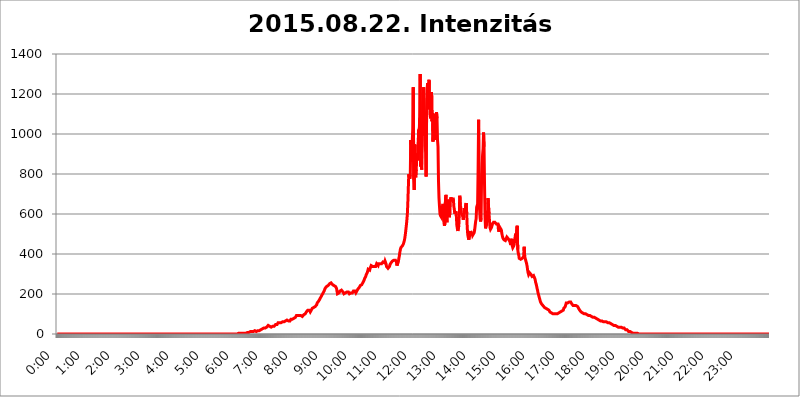
| Category | 2015.08.22. Intenzitás [W/m^2] |
|---|---|
| 0.0 | 0 |
| 0.0006944444444444445 | 0 |
| 0.001388888888888889 | 0 |
| 0.0020833333333333333 | 0 |
| 0.002777777777777778 | 0 |
| 0.003472222222222222 | 0 |
| 0.004166666666666667 | 0 |
| 0.004861111111111111 | 0 |
| 0.005555555555555556 | 0 |
| 0.0062499999999999995 | 0 |
| 0.006944444444444444 | 0 |
| 0.007638888888888889 | 0 |
| 0.008333333333333333 | 0 |
| 0.009027777777777779 | 0 |
| 0.009722222222222222 | 0 |
| 0.010416666666666666 | 0 |
| 0.011111111111111112 | 0 |
| 0.011805555555555555 | 0 |
| 0.012499999999999999 | 0 |
| 0.013194444444444444 | 0 |
| 0.013888888888888888 | 0 |
| 0.014583333333333332 | 0 |
| 0.015277777777777777 | 0 |
| 0.015972222222222224 | 0 |
| 0.016666666666666666 | 0 |
| 0.017361111111111112 | 0 |
| 0.018055555555555557 | 0 |
| 0.01875 | 0 |
| 0.019444444444444445 | 0 |
| 0.02013888888888889 | 0 |
| 0.020833333333333332 | 0 |
| 0.02152777777777778 | 0 |
| 0.022222222222222223 | 0 |
| 0.02291666666666667 | 0 |
| 0.02361111111111111 | 0 |
| 0.024305555555555556 | 0 |
| 0.024999999999999998 | 0 |
| 0.025694444444444447 | 0 |
| 0.02638888888888889 | 0 |
| 0.027083333333333334 | 0 |
| 0.027777777777777776 | 0 |
| 0.02847222222222222 | 0 |
| 0.029166666666666664 | 0 |
| 0.029861111111111113 | 0 |
| 0.030555555555555555 | 0 |
| 0.03125 | 0 |
| 0.03194444444444445 | 0 |
| 0.03263888888888889 | 0 |
| 0.03333333333333333 | 0 |
| 0.034027777777777775 | 0 |
| 0.034722222222222224 | 0 |
| 0.035416666666666666 | 0 |
| 0.036111111111111115 | 0 |
| 0.03680555555555556 | 0 |
| 0.0375 | 0 |
| 0.03819444444444444 | 0 |
| 0.03888888888888889 | 0 |
| 0.03958333333333333 | 0 |
| 0.04027777777777778 | 0 |
| 0.04097222222222222 | 0 |
| 0.041666666666666664 | 0 |
| 0.042361111111111106 | 0 |
| 0.04305555555555556 | 0 |
| 0.043750000000000004 | 0 |
| 0.044444444444444446 | 0 |
| 0.04513888888888889 | 0 |
| 0.04583333333333334 | 0 |
| 0.04652777777777778 | 0 |
| 0.04722222222222222 | 0 |
| 0.04791666666666666 | 0 |
| 0.04861111111111111 | 0 |
| 0.049305555555555554 | 0 |
| 0.049999999999999996 | 0 |
| 0.05069444444444445 | 0 |
| 0.051388888888888894 | 0 |
| 0.052083333333333336 | 0 |
| 0.05277777777777778 | 0 |
| 0.05347222222222222 | 0 |
| 0.05416666666666667 | 0 |
| 0.05486111111111111 | 0 |
| 0.05555555555555555 | 0 |
| 0.05625 | 0 |
| 0.05694444444444444 | 0 |
| 0.057638888888888885 | 0 |
| 0.05833333333333333 | 0 |
| 0.05902777777777778 | 0 |
| 0.059722222222222225 | 0 |
| 0.06041666666666667 | 0 |
| 0.061111111111111116 | 0 |
| 0.06180555555555556 | 0 |
| 0.0625 | 0 |
| 0.06319444444444444 | 0 |
| 0.06388888888888888 | 0 |
| 0.06458333333333334 | 0 |
| 0.06527777777777778 | 0 |
| 0.06597222222222222 | 0 |
| 0.06666666666666667 | 0 |
| 0.06736111111111111 | 0 |
| 0.06805555555555555 | 0 |
| 0.06874999999999999 | 0 |
| 0.06944444444444443 | 0 |
| 0.07013888888888889 | 0 |
| 0.07083333333333333 | 0 |
| 0.07152777777777779 | 0 |
| 0.07222222222222223 | 0 |
| 0.07291666666666667 | 0 |
| 0.07361111111111111 | 0 |
| 0.07430555555555556 | 0 |
| 0.075 | 0 |
| 0.07569444444444444 | 0 |
| 0.0763888888888889 | 0 |
| 0.07708333333333334 | 0 |
| 0.07777777777777778 | 0 |
| 0.07847222222222222 | 0 |
| 0.07916666666666666 | 0 |
| 0.0798611111111111 | 0 |
| 0.08055555555555556 | 0 |
| 0.08125 | 0 |
| 0.08194444444444444 | 0 |
| 0.08263888888888889 | 0 |
| 0.08333333333333333 | 0 |
| 0.08402777777777777 | 0 |
| 0.08472222222222221 | 0 |
| 0.08541666666666665 | 0 |
| 0.08611111111111112 | 0 |
| 0.08680555555555557 | 0 |
| 0.08750000000000001 | 0 |
| 0.08819444444444445 | 0 |
| 0.08888888888888889 | 0 |
| 0.08958333333333333 | 0 |
| 0.09027777777777778 | 0 |
| 0.09097222222222222 | 0 |
| 0.09166666666666667 | 0 |
| 0.09236111111111112 | 0 |
| 0.09305555555555556 | 0 |
| 0.09375 | 0 |
| 0.09444444444444444 | 0 |
| 0.09513888888888888 | 0 |
| 0.09583333333333333 | 0 |
| 0.09652777777777777 | 0 |
| 0.09722222222222222 | 0 |
| 0.09791666666666667 | 0 |
| 0.09861111111111111 | 0 |
| 0.09930555555555555 | 0 |
| 0.09999999999999999 | 0 |
| 0.10069444444444443 | 0 |
| 0.1013888888888889 | 0 |
| 0.10208333333333335 | 0 |
| 0.10277777777777779 | 0 |
| 0.10347222222222223 | 0 |
| 0.10416666666666667 | 0 |
| 0.10486111111111111 | 0 |
| 0.10555555555555556 | 0 |
| 0.10625 | 0 |
| 0.10694444444444444 | 0 |
| 0.1076388888888889 | 0 |
| 0.10833333333333334 | 0 |
| 0.10902777777777778 | 0 |
| 0.10972222222222222 | 0 |
| 0.1111111111111111 | 0 |
| 0.11180555555555556 | 0 |
| 0.11180555555555556 | 0 |
| 0.1125 | 0 |
| 0.11319444444444444 | 0 |
| 0.11388888888888889 | 0 |
| 0.11458333333333333 | 0 |
| 0.11527777777777777 | 0 |
| 0.11597222222222221 | 0 |
| 0.11666666666666665 | 0 |
| 0.1173611111111111 | 0 |
| 0.11805555555555557 | 0 |
| 0.11944444444444445 | 0 |
| 0.12013888888888889 | 0 |
| 0.12083333333333333 | 0 |
| 0.12152777777777778 | 0 |
| 0.12222222222222223 | 0 |
| 0.12291666666666667 | 0 |
| 0.12291666666666667 | 0 |
| 0.12361111111111112 | 0 |
| 0.12430555555555556 | 0 |
| 0.125 | 0 |
| 0.12569444444444444 | 0 |
| 0.12638888888888888 | 0 |
| 0.12708333333333333 | 0 |
| 0.16875 | 0 |
| 0.12847222222222224 | 0 |
| 0.12916666666666668 | 0 |
| 0.12986111111111112 | 0 |
| 0.13055555555555556 | 0 |
| 0.13125 | 0 |
| 0.13194444444444445 | 0 |
| 0.1326388888888889 | 0 |
| 0.13333333333333333 | 0 |
| 0.13402777777777777 | 0 |
| 0.13402777777777777 | 0 |
| 0.13472222222222222 | 0 |
| 0.13541666666666666 | 0 |
| 0.1361111111111111 | 0 |
| 0.13749999999999998 | 0 |
| 0.13819444444444443 | 0 |
| 0.1388888888888889 | 0 |
| 0.13958333333333334 | 0 |
| 0.14027777777777778 | 0 |
| 0.14097222222222222 | 0 |
| 0.14166666666666666 | 0 |
| 0.1423611111111111 | 0 |
| 0.14305555555555557 | 0 |
| 0.14375000000000002 | 0 |
| 0.14444444444444446 | 0 |
| 0.1451388888888889 | 0 |
| 0.1451388888888889 | 0 |
| 0.14652777777777778 | 0 |
| 0.14722222222222223 | 0 |
| 0.14791666666666667 | 0 |
| 0.1486111111111111 | 0 |
| 0.14930555555555555 | 0 |
| 0.15 | 0 |
| 0.15069444444444444 | 0 |
| 0.15138888888888888 | 0 |
| 0.15208333333333332 | 0 |
| 0.15277777777777776 | 0 |
| 0.15347222222222223 | 0 |
| 0.15416666666666667 | 0 |
| 0.15486111111111112 | 0 |
| 0.15555555555555556 | 0 |
| 0.15625 | 0 |
| 0.15694444444444444 | 0 |
| 0.15763888888888888 | 0 |
| 0.15833333333333333 | 0 |
| 0.15902777777777777 | 0 |
| 0.15972222222222224 | 0 |
| 0.16041666666666668 | 0 |
| 0.16111111111111112 | 0 |
| 0.16180555555555556 | 0 |
| 0.1625 | 0 |
| 0.16319444444444445 | 0 |
| 0.1638888888888889 | 0 |
| 0.16458333333333333 | 0 |
| 0.16527777777777777 | 0 |
| 0.16597222222222222 | 0 |
| 0.16666666666666666 | 0 |
| 0.1673611111111111 | 0 |
| 0.16805555555555554 | 0 |
| 0.16874999999999998 | 0 |
| 0.16944444444444443 | 0 |
| 0.17013888888888887 | 0 |
| 0.1708333333333333 | 0 |
| 0.17152777777777775 | 0 |
| 0.17222222222222225 | 0 |
| 0.1729166666666667 | 0 |
| 0.17361111111111113 | 0 |
| 0.17430555555555557 | 0 |
| 0.17500000000000002 | 0 |
| 0.17569444444444446 | 0 |
| 0.1763888888888889 | 0 |
| 0.17708333333333334 | 0 |
| 0.17777777777777778 | 0 |
| 0.17847222222222223 | 0 |
| 0.17916666666666667 | 0 |
| 0.1798611111111111 | 0 |
| 0.18055555555555555 | 0 |
| 0.18125 | 0 |
| 0.18194444444444444 | 0 |
| 0.1826388888888889 | 0 |
| 0.18333333333333335 | 0 |
| 0.1840277777777778 | 0 |
| 0.18472222222222223 | 0 |
| 0.18541666666666667 | 0 |
| 0.18611111111111112 | 0 |
| 0.18680555555555556 | 0 |
| 0.1875 | 0 |
| 0.18819444444444444 | 0 |
| 0.18888888888888888 | 0 |
| 0.18958333333333333 | 0 |
| 0.19027777777777777 | 0 |
| 0.1909722222222222 | 0 |
| 0.19166666666666665 | 0 |
| 0.19236111111111112 | 0 |
| 0.19305555555555554 | 0 |
| 0.19375 | 0 |
| 0.19444444444444445 | 0 |
| 0.1951388888888889 | 0 |
| 0.19583333333333333 | 0 |
| 0.19652777777777777 | 0 |
| 0.19722222222222222 | 0 |
| 0.19791666666666666 | 0 |
| 0.1986111111111111 | 0 |
| 0.19930555555555554 | 0 |
| 0.19999999999999998 | 0 |
| 0.20069444444444443 | 0 |
| 0.20138888888888887 | 0 |
| 0.2020833333333333 | 0 |
| 0.2027777777777778 | 0 |
| 0.2034722222222222 | 0 |
| 0.2041666666666667 | 0 |
| 0.20486111111111113 | 0 |
| 0.20555555555555557 | 0 |
| 0.20625000000000002 | 0 |
| 0.20694444444444446 | 0 |
| 0.2076388888888889 | 0 |
| 0.20833333333333334 | 0 |
| 0.20902777777777778 | 0 |
| 0.20972222222222223 | 0 |
| 0.21041666666666667 | 0 |
| 0.2111111111111111 | 0 |
| 0.21180555555555555 | 0 |
| 0.2125 | 0 |
| 0.21319444444444444 | 0 |
| 0.2138888888888889 | 0 |
| 0.21458333333333335 | 0 |
| 0.2152777777777778 | 0 |
| 0.21597222222222223 | 0 |
| 0.21666666666666667 | 0 |
| 0.21736111111111112 | 0 |
| 0.21805555555555556 | 0 |
| 0.21875 | 0 |
| 0.21944444444444444 | 0 |
| 0.22013888888888888 | 0 |
| 0.22083333333333333 | 0 |
| 0.22152777777777777 | 0 |
| 0.2222222222222222 | 0 |
| 0.22291666666666665 | 0 |
| 0.2236111111111111 | 0 |
| 0.22430555555555556 | 0 |
| 0.225 | 0 |
| 0.22569444444444445 | 0 |
| 0.2263888888888889 | 0 |
| 0.22708333333333333 | 0 |
| 0.22777777777777777 | 0 |
| 0.22847222222222222 | 0 |
| 0.22916666666666666 | 0 |
| 0.2298611111111111 | 0 |
| 0.23055555555555554 | 0 |
| 0.23124999999999998 | 0 |
| 0.23194444444444443 | 0 |
| 0.23263888888888887 | 0 |
| 0.2333333333333333 | 0 |
| 0.2340277777777778 | 0 |
| 0.2347222222222222 | 0 |
| 0.2354166666666667 | 0 |
| 0.23611111111111113 | 0 |
| 0.23680555555555557 | 0 |
| 0.23750000000000002 | 0 |
| 0.23819444444444446 | 0 |
| 0.2388888888888889 | 0 |
| 0.23958333333333334 | 0 |
| 0.24027777777777778 | 0 |
| 0.24097222222222223 | 0 |
| 0.24166666666666667 | 0 |
| 0.2423611111111111 | 0 |
| 0.24305555555555555 | 0 |
| 0.24375 | 0 |
| 0.24444444444444446 | 0 |
| 0.24513888888888888 | 0 |
| 0.24583333333333335 | 0 |
| 0.2465277777777778 | 0 |
| 0.24722222222222223 | 0 |
| 0.24791666666666667 | 0 |
| 0.24861111111111112 | 0 |
| 0.24930555555555556 | 0 |
| 0.25 | 0 |
| 0.25069444444444444 | 0 |
| 0.2513888888888889 | 0 |
| 0.2520833333333333 | 0 |
| 0.25277777777777777 | 0 |
| 0.2534722222222222 | 3.525 |
| 0.25416666666666665 | 3.525 |
| 0.2548611111111111 | 3.525 |
| 0.2555555555555556 | 3.525 |
| 0.25625000000000003 | 3.525 |
| 0.2569444444444445 | 3.525 |
| 0.2576388888888889 | 3.525 |
| 0.25833333333333336 | 3.525 |
| 0.2590277777777778 | 3.525 |
| 0.25972222222222224 | 3.525 |
| 0.2604166666666667 | 3.525 |
| 0.2611111111111111 | 3.525 |
| 0.26180555555555557 | 3.525 |
| 0.2625 | 3.525 |
| 0.26319444444444445 | 3.525 |
| 0.2638888888888889 | 3.525 |
| 0.26458333333333334 | 3.525 |
| 0.2652777777777778 | 3.525 |
| 0.2659722222222222 | 3.525 |
| 0.26666666666666666 | 7.887 |
| 0.2673611111111111 | 7.887 |
| 0.26805555555555555 | 7.887 |
| 0.26875 | 7.887 |
| 0.26944444444444443 | 7.887 |
| 0.2701388888888889 | 12.257 |
| 0.2708333333333333 | 12.257 |
| 0.27152777777777776 | 12.257 |
| 0.2722222222222222 | 12.257 |
| 0.27291666666666664 | 12.257 |
| 0.2736111111111111 | 12.257 |
| 0.2743055555555555 | 12.257 |
| 0.27499999999999997 | 12.257 |
| 0.27569444444444446 | 12.257 |
| 0.27638888888888885 | 16.636 |
| 0.27708333333333335 | 16.636 |
| 0.2777777777777778 | 12.257 |
| 0.27847222222222223 | 12.257 |
| 0.2791666666666667 | 12.257 |
| 0.2798611111111111 | 16.636 |
| 0.28055555555555556 | 16.636 |
| 0.28125 | 16.636 |
| 0.28194444444444444 | 16.636 |
| 0.2826388888888889 | 16.636 |
| 0.2833333333333333 | 16.636 |
| 0.28402777777777777 | 16.636 |
| 0.2847222222222222 | 21.024 |
| 0.28541666666666665 | 21.024 |
| 0.28611111111111115 | 25.419 |
| 0.28680555555555554 | 25.419 |
| 0.28750000000000003 | 25.419 |
| 0.2881944444444445 | 25.419 |
| 0.2888888888888889 | 29.823 |
| 0.28958333333333336 | 29.823 |
| 0.2902777777777778 | 29.823 |
| 0.29097222222222224 | 29.823 |
| 0.2916666666666667 | 29.823 |
| 0.2923611111111111 | 34.234 |
| 0.29305555555555557 | 34.234 |
| 0.29375 | 34.234 |
| 0.29444444444444445 | 34.234 |
| 0.2951388888888889 | 38.653 |
| 0.29583333333333334 | 43.079 |
| 0.2965277777777778 | 43.079 |
| 0.2972222222222222 | 38.653 |
| 0.29791666666666666 | 38.653 |
| 0.2986111111111111 | 34.234 |
| 0.29930555555555555 | 34.234 |
| 0.3 | 34.234 |
| 0.30069444444444443 | 38.653 |
| 0.3013888888888889 | 38.653 |
| 0.3020833333333333 | 38.653 |
| 0.30277777777777776 | 38.653 |
| 0.3034722222222222 | 38.653 |
| 0.30416666666666664 | 38.653 |
| 0.3048611111111111 | 43.079 |
| 0.3055555555555555 | 43.079 |
| 0.30624999999999997 | 47.511 |
| 0.3069444444444444 | 47.511 |
| 0.3076388888888889 | 43.079 |
| 0.30833333333333335 | 47.511 |
| 0.3090277777777778 | 51.951 |
| 0.30972222222222223 | 56.398 |
| 0.3104166666666667 | 56.398 |
| 0.3111111111111111 | 56.398 |
| 0.31180555555555556 | 56.398 |
| 0.3125 | 56.398 |
| 0.31319444444444444 | 56.398 |
| 0.3138888888888889 | 56.398 |
| 0.3145833333333333 | 56.398 |
| 0.31527777777777777 | 60.85 |
| 0.3159722222222222 | 60.85 |
| 0.31666666666666665 | 60.85 |
| 0.31736111111111115 | 60.85 |
| 0.31805555555555554 | 60.85 |
| 0.31875000000000003 | 65.31 |
| 0.3194444444444445 | 65.31 |
| 0.3201388888888889 | 65.31 |
| 0.32083333333333336 | 69.775 |
| 0.3215277777777778 | 69.775 |
| 0.32222222222222224 | 69.775 |
| 0.3229166666666667 | 65.31 |
| 0.3236111111111111 | 65.31 |
| 0.32430555555555557 | 65.31 |
| 0.325 | 65.31 |
| 0.32569444444444445 | 65.31 |
| 0.3263888888888889 | 65.31 |
| 0.32708333333333334 | 69.775 |
| 0.3277777777777778 | 74.246 |
| 0.3284722222222222 | 69.775 |
| 0.32916666666666666 | 74.246 |
| 0.3298611111111111 | 74.246 |
| 0.33055555555555555 | 74.246 |
| 0.33125 | 74.246 |
| 0.33194444444444443 | 78.722 |
| 0.3326388888888889 | 78.722 |
| 0.3333333333333333 | 78.722 |
| 0.3340277777777778 | 83.205 |
| 0.3347222222222222 | 87.692 |
| 0.3354166666666667 | 92.184 |
| 0.3361111111111111 | 92.184 |
| 0.3368055555555556 | 92.184 |
| 0.33749999999999997 | 92.184 |
| 0.33819444444444446 | 92.184 |
| 0.33888888888888885 | 92.184 |
| 0.33958333333333335 | 92.184 |
| 0.34027777777777773 | 92.184 |
| 0.34097222222222223 | 92.184 |
| 0.3416666666666666 | 92.184 |
| 0.3423611111111111 | 92.184 |
| 0.3430555555555555 | 92.184 |
| 0.34375 | 87.692 |
| 0.3444444444444445 | 92.184 |
| 0.3451388888888889 | 92.184 |
| 0.3458333333333334 | 96.682 |
| 0.34652777777777777 | 96.682 |
| 0.34722222222222227 | 96.682 |
| 0.34791666666666665 | 101.184 |
| 0.34861111111111115 | 105.69 |
| 0.34930555555555554 | 110.201 |
| 0.35000000000000003 | 114.716 |
| 0.3506944444444444 | 114.716 |
| 0.3513888888888889 | 119.235 |
| 0.3520833333333333 | 119.235 |
| 0.3527777777777778 | 114.716 |
| 0.3534722222222222 | 119.235 |
| 0.3541666666666667 | 114.716 |
| 0.3548611111111111 | 110.201 |
| 0.35555555555555557 | 114.716 |
| 0.35625 | 119.235 |
| 0.35694444444444445 | 119.235 |
| 0.3576388888888889 | 128.284 |
| 0.35833333333333334 | 128.284 |
| 0.3590277777777778 | 132.814 |
| 0.3597222222222222 | 132.814 |
| 0.36041666666666666 | 132.814 |
| 0.3611111111111111 | 137.347 |
| 0.36180555555555555 | 137.347 |
| 0.3625 | 141.884 |
| 0.36319444444444443 | 141.884 |
| 0.3638888888888889 | 146.423 |
| 0.3645833333333333 | 155.509 |
| 0.3652777777777778 | 155.509 |
| 0.3659722222222222 | 160.056 |
| 0.3666666666666667 | 164.605 |
| 0.3673611111111111 | 169.156 |
| 0.3680555555555556 | 173.709 |
| 0.36874999999999997 | 173.709 |
| 0.36944444444444446 | 182.82 |
| 0.37013888888888885 | 187.378 |
| 0.37083333333333335 | 187.378 |
| 0.37152777777777773 | 196.497 |
| 0.37222222222222223 | 201.058 |
| 0.3729166666666666 | 205.62 |
| 0.3736111111111111 | 210.182 |
| 0.3743055555555555 | 214.746 |
| 0.375 | 219.309 |
| 0.3756944444444445 | 228.436 |
| 0.3763888888888889 | 233 |
| 0.3770833333333334 | 233 |
| 0.37777777777777777 | 237.564 |
| 0.37847222222222227 | 242.127 |
| 0.37916666666666665 | 242.127 |
| 0.37986111111111115 | 242.127 |
| 0.38055555555555554 | 246.689 |
| 0.38125000000000003 | 246.689 |
| 0.3819444444444444 | 251.251 |
| 0.3826388888888889 | 251.251 |
| 0.3833333333333333 | 251.251 |
| 0.3840277777777778 | 255.813 |
| 0.3847222222222222 | 251.251 |
| 0.3854166666666667 | 251.251 |
| 0.3861111111111111 | 246.689 |
| 0.38680555555555557 | 246.689 |
| 0.3875 | 242.127 |
| 0.38819444444444445 | 242.127 |
| 0.3888888888888889 | 242.127 |
| 0.38958333333333334 | 237.564 |
| 0.3902777777777778 | 237.564 |
| 0.3909722222222222 | 233 |
| 0.39166666666666666 | 228.436 |
| 0.3923611111111111 | 214.746 |
| 0.39305555555555555 | 201.058 |
| 0.39375 | 201.058 |
| 0.39444444444444443 | 205.62 |
| 0.3951388888888889 | 205.62 |
| 0.3958333333333333 | 210.182 |
| 0.3965277777777778 | 214.746 |
| 0.3972222222222222 | 214.746 |
| 0.3979166666666667 | 219.309 |
| 0.3986111111111111 | 219.309 |
| 0.3993055555555556 | 219.309 |
| 0.39999999999999997 | 214.746 |
| 0.40069444444444446 | 210.182 |
| 0.40138888888888885 | 210.182 |
| 0.40208333333333335 | 201.058 |
| 0.40277777777777773 | 196.497 |
| 0.40347222222222223 | 196.497 |
| 0.4041666666666666 | 205.62 |
| 0.4048611111111111 | 201.058 |
| 0.4055555555555555 | 205.62 |
| 0.40625 | 210.182 |
| 0.4069444444444445 | 210.182 |
| 0.4076388888888889 | 210.182 |
| 0.4083333333333334 | 210.182 |
| 0.40902777777777777 | 205.62 |
| 0.40972222222222227 | 201.058 |
| 0.41041666666666665 | 201.058 |
| 0.41111111111111115 | 205.62 |
| 0.41180555555555554 | 205.62 |
| 0.41250000000000003 | 205.62 |
| 0.4131944444444444 | 205.62 |
| 0.4138888888888889 | 205.62 |
| 0.4145833333333333 | 210.182 |
| 0.4152777777777778 | 214.746 |
| 0.4159722222222222 | 219.309 |
| 0.4166666666666667 | 219.309 |
| 0.4173611111111111 | 214.746 |
| 0.41805555555555557 | 210.182 |
| 0.41875 | 205.62 |
| 0.41944444444444445 | 210.182 |
| 0.4201388888888889 | 214.746 |
| 0.42083333333333334 | 219.309 |
| 0.4215277777777778 | 223.873 |
| 0.4222222222222222 | 228.436 |
| 0.42291666666666666 | 223.873 |
| 0.4236111111111111 | 233 |
| 0.42430555555555555 | 237.564 |
| 0.425 | 242.127 |
| 0.42569444444444443 | 246.689 |
| 0.4263888888888889 | 246.689 |
| 0.4270833333333333 | 246.689 |
| 0.4277777777777778 | 251.251 |
| 0.4284722222222222 | 255.813 |
| 0.4291666666666667 | 260.373 |
| 0.4298611111111111 | 264.932 |
| 0.4305555555555556 | 269.49 |
| 0.43124999999999997 | 278.603 |
| 0.43194444444444446 | 278.603 |
| 0.43263888888888885 | 287.709 |
| 0.43333333333333335 | 296.808 |
| 0.43402777777777773 | 296.808 |
| 0.43472222222222223 | 305.898 |
| 0.4354166666666666 | 314.98 |
| 0.4361111111111111 | 324.052 |
| 0.4368055555555555 | 324.052 |
| 0.4375 | 319.517 |
| 0.4381944444444445 | 319.517 |
| 0.4388888888888889 | 328.584 |
| 0.4395833333333334 | 333.113 |
| 0.44027777777777777 | 342.162 |
| 0.44097222222222227 | 342.162 |
| 0.44166666666666665 | 337.639 |
| 0.44236111111111115 | 337.639 |
| 0.44305555555555554 | 337.639 |
| 0.44375000000000003 | 333.113 |
| 0.4444444444444444 | 337.639 |
| 0.4451388888888889 | 337.639 |
| 0.4458333333333333 | 333.113 |
| 0.4465277777777778 | 337.639 |
| 0.4472222222222222 | 342.162 |
| 0.4479166666666667 | 351.198 |
| 0.4486111111111111 | 346.682 |
| 0.44930555555555557 | 346.682 |
| 0.45 | 342.162 |
| 0.45069444444444445 | 351.198 |
| 0.4513888888888889 | 355.712 |
| 0.45208333333333334 | 346.682 |
| 0.4527777777777778 | 351.198 |
| 0.4534722222222222 | 355.712 |
| 0.45416666666666666 | 355.712 |
| 0.4548611111111111 | 351.198 |
| 0.45555555555555555 | 351.198 |
| 0.45625 | 351.198 |
| 0.45694444444444443 | 360.221 |
| 0.4576388888888889 | 360.221 |
| 0.4583333333333333 | 360.221 |
| 0.4590277777777778 | 355.712 |
| 0.4597222222222222 | 364.728 |
| 0.4604166666666667 | 360.221 |
| 0.4611111111111111 | 351.198 |
| 0.4618055555555556 | 337.639 |
| 0.46249999999999997 | 337.639 |
| 0.46319444444444446 | 337.639 |
| 0.46388888888888885 | 328.584 |
| 0.46458333333333335 | 324.052 |
| 0.46527777777777773 | 333.113 |
| 0.46597222222222223 | 337.639 |
| 0.4666666666666666 | 346.682 |
| 0.4673611111111111 | 351.198 |
| 0.4680555555555555 | 355.712 |
| 0.46875 | 360.221 |
| 0.4694444444444445 | 360.221 |
| 0.4701388888888889 | 364.728 |
| 0.4708333333333334 | 364.728 |
| 0.47152777777777777 | 369.23 |
| 0.47222222222222227 | 369.23 |
| 0.47291666666666665 | 369.23 |
| 0.47361111111111115 | 373.729 |
| 0.47430555555555554 | 369.23 |
| 0.47500000000000003 | 364.728 |
| 0.4756944444444444 | 360.221 |
| 0.4763888888888889 | 342.162 |
| 0.4770833333333333 | 337.639 |
| 0.4777777777777778 | 346.682 |
| 0.4784722222222222 | 364.728 |
| 0.4791666666666667 | 378.224 |
| 0.4798611111111111 | 391.685 |
| 0.48055555555555557 | 409.574 |
| 0.48125 | 422.943 |
| 0.48194444444444445 | 431.833 |
| 0.4826388888888889 | 436.27 |
| 0.48333333333333334 | 436.27 |
| 0.4840277777777778 | 440.702 |
| 0.4847222222222222 | 440.702 |
| 0.48541666666666666 | 449.551 |
| 0.4861111111111111 | 453.968 |
| 0.48680555555555555 | 467.187 |
| 0.4875 | 480.356 |
| 0.48819444444444443 | 497.836 |
| 0.4888888888888889 | 519.555 |
| 0.4895833333333333 | 541.121 |
| 0.4902777777777778 | 566.793 |
| 0.4909722222222222 | 596.45 |
| 0.4916666666666667 | 650.667 |
| 0.4923611111111111 | 727.896 |
| 0.4930555555555556 | 798.974 |
| 0.49374999999999997 | 783.342 |
| 0.49444444444444446 | 775.492 |
| 0.49513888888888885 | 795.074 |
| 0.49583333333333335 | 970.034 |
| 0.49652777777777773 | 860.676 |
| 0.49722222222222223 | 928.819 |
| 0.4979166666666666 | 966.295 |
| 0.4986111111111111 | 1026.06 |
| 0.4993055555555555 | 1233.951 |
| 0.5 | 771.559 |
| 0.5006944444444444 | 719.877 |
| 0.5013888888888889 | 947.58 |
| 0.5020833333333333 | 802.868 |
| 0.5027777777777778 | 783.342 |
| 0.5034722222222222 | 822.26 |
| 0.5041666666666667 | 875.918 |
| 0.5048611111111111 | 902.447 |
| 0.5055555555555555 | 868.305 |
| 0.50625 | 958.814 |
| 0.5069444444444444 | 1022.323 |
| 0.5076388888888889 | 999.916 |
| 0.5083333333333333 | 1082.324 |
| 0.5090277777777777 | 1300.514 |
| 0.5097222222222222 | 837.682 |
| 0.5104166666666666 | 868.305 |
| 0.5111111111111112 | 822.26 |
| 0.5118055555555555 | 1056.004 |
| 0.5125000000000001 | 992.448 |
| 0.5131944444444444 | 1162.571 |
| 0.513888888888889 | 1233.951 |
| 0.5145833333333333 | 1116.426 |
| 0.5152777777777778 | 1056.004 |
| 0.5159722222222222 | 936.33 |
| 0.5166666666666667 | 909.996 |
| 0.517361111111111 | 787.258 |
| 0.5180555555555556 | 1116.426 |
| 0.5187499999999999 | 1225.859 |
| 0.5194444444444445 | 1254.387 |
| 0.5201388888888888 | 1124.056 |
| 0.5208333333333334 | 1246.176 |
| 0.5215277777777778 | 1270.964 |
| 0.5222222222222223 | 1162.571 |
| 0.5229166666666667 | 1097.437 |
| 0.5236111111111111 | 1078.555 |
| 0.5243055555555556 | 1124.056 |
| 0.525 | 1209.807 |
| 0.5256944444444445 | 1063.51 |
| 0.5263888888888889 | 1105.019 |
| 0.5270833333333333 | 962.555 |
| 0.5277777777777778 | 1101.226 |
| 0.5284722222222222 | 1037.277 |
| 0.5291666666666667 | 970.034 |
| 0.5298611111111111 | 1011.118 |
| 0.5305555555555556 | 1082.324 |
| 0.53125 | 1044.762 |
| 0.5319444444444444 | 1108.816 |
| 0.5326388888888889 | 1078.555 |
| 0.5333333333333333 | 970.034 |
| 0.5340277777777778 | 936.33 |
| 0.5347222222222222 | 763.674 |
| 0.5354166666666667 | 679.395 |
| 0.5361111111111111 | 638.256 |
| 0.5368055555555555 | 600.661 |
| 0.5375 | 592.233 |
| 0.5381944444444444 | 592.233 |
| 0.5388888888888889 | 583.779 |
| 0.5395833333333333 | 621.613 |
| 0.5402777777777777 | 638.256 |
| 0.5409722222222222 | 650.667 |
| 0.5416666666666666 | 638.256 |
| 0.5423611111111112 | 558.261 |
| 0.5430555555555555 | 541.121 |
| 0.5437500000000001 | 553.986 |
| 0.5444444444444444 | 675.311 |
| 0.545138888888889 | 695.666 |
| 0.5458333333333333 | 575.299 |
| 0.5465277777777778 | 558.261 |
| 0.5472222222222222 | 671.22 |
| 0.5479166666666667 | 654.791 |
| 0.548611111111111 | 642.4 |
| 0.5493055555555556 | 625.784 |
| 0.5499999999999999 | 583.779 |
| 0.5506944444444445 | 609.062 |
| 0.5513888888888888 | 663.019 |
| 0.5520833333333334 | 683.473 |
| 0.5527777777777778 | 667.123 |
| 0.5534722222222223 | 675.311 |
| 0.5541666666666667 | 671.22 |
| 0.5548611111111111 | 675.311 |
| 0.5555555555555556 | 675.311 |
| 0.55625 | 638.256 |
| 0.5569444444444445 | 621.613 |
| 0.5576388888888889 | 600.661 |
| 0.5583333333333333 | 596.45 |
| 0.5590277777777778 | 613.252 |
| 0.5597222222222222 | 592.233 |
| 0.5604166666666667 | 545.416 |
| 0.5611111111111111 | 528.2 |
| 0.5618055555555556 | 515.223 |
| 0.5625 | 510.885 |
| 0.5631944444444444 | 541.121 |
| 0.5638888888888889 | 600.661 |
| 0.5645833333333333 | 691.608 |
| 0.5652777777777778 | 642.4 |
| 0.5659722222222222 | 634.105 |
| 0.5666666666666667 | 604.864 |
| 0.5673611111111111 | 604.864 |
| 0.5680555555555555 | 609.062 |
| 0.56875 | 588.009 |
| 0.5694444444444444 | 571.049 |
| 0.5701388888888889 | 588.009 |
| 0.5708333333333333 | 629.948 |
| 0.5715277777777777 | 609.062 |
| 0.5722222222222222 | 604.864 |
| 0.5729166666666666 | 609.062 |
| 0.5736111111111112 | 654.791 |
| 0.5743055555555555 | 600.661 |
| 0.5750000000000001 | 532.513 |
| 0.5756944444444444 | 497.836 |
| 0.576388888888889 | 497.836 |
| 0.5770833333333333 | 471.582 |
| 0.5777777777777778 | 480.356 |
| 0.5784722222222222 | 489.108 |
| 0.5791666666666667 | 493.475 |
| 0.579861111111111 | 515.223 |
| 0.5805555555555556 | 515.223 |
| 0.5812499999999999 | 493.475 |
| 0.5819444444444445 | 506.542 |
| 0.5826388888888888 | 493.475 |
| 0.5833333333333334 | 489.108 |
| 0.5840277777777778 | 493.475 |
| 0.5847222222222223 | 506.542 |
| 0.5854166666666667 | 519.555 |
| 0.5861111111111111 | 541.121 |
| 0.5868055555555556 | 562.53 |
| 0.5875 | 575.299 |
| 0.5881944444444445 | 634.105 |
| 0.5888888888888889 | 634.105 |
| 0.5895833333333333 | 650.667 |
| 0.5902777777777778 | 826.123 |
| 0.5909722222222222 | 1071.027 |
| 0.5916666666666667 | 634.105 |
| 0.5923611111111111 | 621.613 |
| 0.5930555555555556 | 579.542 |
| 0.59375 | 562.53 |
| 0.5944444444444444 | 579.542 |
| 0.5951388888888889 | 787.258 |
| 0.5958333333333333 | 791.169 |
| 0.5965277777777778 | 894.885 |
| 0.5972222222222222 | 925.06 |
| 0.5979166666666667 | 1007.383 |
| 0.5986111111111111 | 936.33 |
| 0.5993055555555555 | 739.877 |
| 0.6 | 583.779 |
| 0.6006944444444444 | 528.2 |
| 0.6013888888888889 | 528.2 |
| 0.6020833333333333 | 549.704 |
| 0.6027777777777777 | 566.793 |
| 0.6034722222222222 | 600.661 |
| 0.6041666666666666 | 679.395 |
| 0.6048611111111112 | 683.473 |
| 0.6055555555555555 | 600.661 |
| 0.6062500000000001 | 566.793 |
| 0.6069444444444444 | 532.513 |
| 0.607638888888889 | 523.88 |
| 0.6083333333333333 | 523.88 |
| 0.6090277777777778 | 532.513 |
| 0.6097222222222222 | 541.121 |
| 0.6104166666666667 | 549.704 |
| 0.611111111111111 | 553.986 |
| 0.6118055555555556 | 558.261 |
| 0.6124999999999999 | 558.261 |
| 0.6131944444444445 | 558.261 |
| 0.6138888888888888 | 558.261 |
| 0.6145833333333334 | 558.261 |
| 0.6152777777777778 | 553.986 |
| 0.6159722222222223 | 549.704 |
| 0.6166666666666667 | 549.704 |
| 0.6173611111111111 | 553.986 |
| 0.6180555555555556 | 549.704 |
| 0.61875 | 523.88 |
| 0.6194444444444445 | 510.885 |
| 0.6201388888888889 | 519.555 |
| 0.6208333333333333 | 532.513 |
| 0.6215277777777778 | 532.513 |
| 0.6222222222222222 | 528.2 |
| 0.6229166666666667 | 519.555 |
| 0.6236111111111111 | 502.192 |
| 0.6243055555555556 | 489.108 |
| 0.625 | 480.356 |
| 0.6256944444444444 | 475.972 |
| 0.6263888888888889 | 471.582 |
| 0.6270833333333333 | 471.582 |
| 0.6277777777777778 | 467.187 |
| 0.6284722222222222 | 467.187 |
| 0.6291666666666667 | 471.582 |
| 0.6298611111111111 | 471.582 |
| 0.6305555555555555 | 484.735 |
| 0.63125 | 484.735 |
| 0.6319444444444444 | 484.735 |
| 0.6326388888888889 | 475.972 |
| 0.6333333333333333 | 475.972 |
| 0.6340277777777777 | 471.582 |
| 0.6347222222222222 | 462.786 |
| 0.6354166666666666 | 458.38 |
| 0.6361111111111112 | 445.129 |
| 0.6368055555555555 | 449.551 |
| 0.6375000000000001 | 475.972 |
| 0.6381944444444444 | 440.702 |
| 0.638888888888889 | 431.833 |
| 0.6395833333333333 | 431.833 |
| 0.6402777777777778 | 440.702 |
| 0.6409722222222222 | 449.551 |
| 0.6416666666666667 | 471.582 |
| 0.642361111111111 | 489.108 |
| 0.6430555555555556 | 502.192 |
| 0.6437499999999999 | 484.735 |
| 0.6444444444444445 | 489.108 |
| 0.6451388888888888 | 541.121 |
| 0.6458333333333334 | 422.943 |
| 0.6465277777777778 | 405.108 |
| 0.6472222222222223 | 396.164 |
| 0.6479166666666667 | 378.224 |
| 0.6486111111111111 | 373.729 |
| 0.6493055555555556 | 373.729 |
| 0.65 | 373.729 |
| 0.6506944444444445 | 378.224 |
| 0.6513888888888889 | 378.224 |
| 0.6520833333333333 | 378.224 |
| 0.6527777777777778 | 378.224 |
| 0.6534722222222222 | 378.224 |
| 0.6541666666666667 | 387.202 |
| 0.6548611111111111 | 436.27 |
| 0.6555555555555556 | 391.685 |
| 0.65625 | 378.224 |
| 0.6569444444444444 | 369.23 |
| 0.6576388888888889 | 360.221 |
| 0.6583333333333333 | 351.198 |
| 0.6590277777777778 | 337.639 |
| 0.6597222222222222 | 319.517 |
| 0.6604166666666667 | 305.898 |
| 0.6611111111111111 | 296.808 |
| 0.6618055555555555 | 296.808 |
| 0.6625 | 305.898 |
| 0.6631944444444444 | 305.898 |
| 0.6638888888888889 | 301.354 |
| 0.6645833333333333 | 296.808 |
| 0.6652777777777777 | 292.259 |
| 0.6659722222222222 | 287.709 |
| 0.6666666666666666 | 287.709 |
| 0.6673611111111111 | 287.709 |
| 0.6680555555555556 | 292.259 |
| 0.6687500000000001 | 287.709 |
| 0.6694444444444444 | 287.709 |
| 0.6701388888888888 | 274.047 |
| 0.6708333333333334 | 260.373 |
| 0.6715277777777778 | 251.251 |
| 0.6722222222222222 | 242.127 |
| 0.6729166666666666 | 228.436 |
| 0.6736111111111112 | 219.309 |
| 0.6743055555555556 | 205.62 |
| 0.6749999999999999 | 196.497 |
| 0.6756944444444444 | 187.378 |
| 0.6763888888888889 | 178.264 |
| 0.6770833333333334 | 169.156 |
| 0.6777777777777777 | 160.056 |
| 0.6784722222222223 | 155.509 |
| 0.6791666666666667 | 150.964 |
| 0.6798611111111111 | 146.423 |
| 0.6805555555555555 | 146.423 |
| 0.68125 | 141.884 |
| 0.6819444444444445 | 137.347 |
| 0.6826388888888889 | 137.347 |
| 0.6833333333333332 | 132.814 |
| 0.6840277777777778 | 132.814 |
| 0.6847222222222222 | 128.284 |
| 0.6854166666666667 | 128.284 |
| 0.686111111111111 | 128.284 |
| 0.6868055555555556 | 123.758 |
| 0.6875 | 123.758 |
| 0.6881944444444444 | 123.758 |
| 0.688888888888889 | 119.235 |
| 0.6895833333333333 | 119.235 |
| 0.6902777777777778 | 114.716 |
| 0.6909722222222222 | 110.201 |
| 0.6916666666666668 | 110.201 |
| 0.6923611111111111 | 105.69 |
| 0.6930555555555555 | 105.69 |
| 0.69375 | 101.184 |
| 0.6944444444444445 | 101.184 |
| 0.6951388888888889 | 101.184 |
| 0.6958333333333333 | 101.184 |
| 0.6965277777777777 | 101.184 |
| 0.6972222222222223 | 101.184 |
| 0.6979166666666666 | 101.184 |
| 0.6986111111111111 | 101.184 |
| 0.6993055555555556 | 101.184 |
| 0.7000000000000001 | 101.184 |
| 0.7006944444444444 | 101.184 |
| 0.7013888888888888 | 101.184 |
| 0.7020833333333334 | 101.184 |
| 0.7027777777777778 | 101.184 |
| 0.7034722222222222 | 105.69 |
| 0.7041666666666666 | 105.69 |
| 0.7048611111111112 | 110.201 |
| 0.7055555555555556 | 110.201 |
| 0.7062499999999999 | 110.201 |
| 0.7069444444444444 | 110.201 |
| 0.7076388888888889 | 114.716 |
| 0.7083333333333334 | 114.716 |
| 0.7090277777777777 | 119.235 |
| 0.7097222222222223 | 119.235 |
| 0.7104166666666667 | 128.284 |
| 0.7111111111111111 | 128.284 |
| 0.7118055555555555 | 132.814 |
| 0.7125 | 137.347 |
| 0.7131944444444445 | 146.423 |
| 0.7138888888888889 | 155.509 |
| 0.7145833333333332 | 155.509 |
| 0.7152777777777778 | 155.509 |
| 0.7159722222222222 | 155.509 |
| 0.7166666666666667 | 155.509 |
| 0.717361111111111 | 160.056 |
| 0.7180555555555556 | 160.056 |
| 0.71875 | 160.056 |
| 0.7194444444444444 | 160.056 |
| 0.720138888888889 | 160.056 |
| 0.7208333333333333 | 155.509 |
| 0.7215277777777778 | 150.964 |
| 0.7222222222222222 | 146.423 |
| 0.7229166666666668 | 146.423 |
| 0.7236111111111111 | 141.884 |
| 0.7243055555555555 | 141.884 |
| 0.725 | 141.884 |
| 0.7256944444444445 | 141.884 |
| 0.7263888888888889 | 141.884 |
| 0.7270833333333333 | 141.884 |
| 0.7277777777777777 | 141.884 |
| 0.7284722222222223 | 141.884 |
| 0.7291666666666666 | 141.884 |
| 0.7298611111111111 | 137.347 |
| 0.7305555555555556 | 132.814 |
| 0.7312500000000001 | 128.284 |
| 0.7319444444444444 | 123.758 |
| 0.7326388888888888 | 119.235 |
| 0.7333333333333334 | 119.235 |
| 0.7340277777777778 | 114.716 |
| 0.7347222222222222 | 110.201 |
| 0.7354166666666666 | 110.201 |
| 0.7361111111111112 | 105.69 |
| 0.7368055555555556 | 105.69 |
| 0.7374999999999999 | 105.69 |
| 0.7381944444444444 | 101.184 |
| 0.7388888888888889 | 101.184 |
| 0.7395833333333334 | 101.184 |
| 0.7402777777777777 | 101.184 |
| 0.7409722222222223 | 101.184 |
| 0.7416666666666667 | 101.184 |
| 0.7423611111111111 | 96.682 |
| 0.7430555555555555 | 96.682 |
| 0.74375 | 96.682 |
| 0.7444444444444445 | 96.682 |
| 0.7451388888888889 | 92.184 |
| 0.7458333333333332 | 92.184 |
| 0.7465277777777778 | 92.184 |
| 0.7472222222222222 | 92.184 |
| 0.7479166666666667 | 92.184 |
| 0.748611111111111 | 87.692 |
| 0.7493055555555556 | 87.692 |
| 0.75 | 87.692 |
| 0.7506944444444444 | 83.205 |
| 0.751388888888889 | 83.205 |
| 0.7520833333333333 | 83.205 |
| 0.7527777777777778 | 83.205 |
| 0.7534722222222222 | 83.205 |
| 0.7541666666666668 | 78.722 |
| 0.7548611111111111 | 78.722 |
| 0.7555555555555555 | 78.722 |
| 0.75625 | 78.722 |
| 0.7569444444444445 | 74.246 |
| 0.7576388888888889 | 74.246 |
| 0.7583333333333333 | 74.246 |
| 0.7590277777777777 | 74.246 |
| 0.7597222222222223 | 69.775 |
| 0.7604166666666666 | 69.775 |
| 0.7611111111111111 | 69.775 |
| 0.7618055555555556 | 65.31 |
| 0.7625000000000001 | 65.31 |
| 0.7631944444444444 | 65.31 |
| 0.7638888888888888 | 65.31 |
| 0.7645833333333334 | 65.31 |
| 0.7652777777777778 | 65.31 |
| 0.7659722222222222 | 60.85 |
| 0.7666666666666666 | 60.85 |
| 0.7673611111111112 | 60.85 |
| 0.7680555555555556 | 60.85 |
| 0.7687499999999999 | 60.85 |
| 0.7694444444444444 | 60.85 |
| 0.7701388888888889 | 60.85 |
| 0.7708333333333334 | 56.398 |
| 0.7715277777777777 | 56.398 |
| 0.7722222222222223 | 56.398 |
| 0.7729166666666667 | 56.398 |
| 0.7736111111111111 | 56.398 |
| 0.7743055555555555 | 56.398 |
| 0.775 | 56.398 |
| 0.7756944444444445 | 51.951 |
| 0.7763888888888889 | 51.951 |
| 0.7770833333333332 | 47.511 |
| 0.7777777777777778 | 47.511 |
| 0.7784722222222222 | 47.511 |
| 0.7791666666666667 | 47.511 |
| 0.779861111111111 | 43.079 |
| 0.7805555555555556 | 43.079 |
| 0.78125 | 43.079 |
| 0.7819444444444444 | 43.079 |
| 0.782638888888889 | 43.079 |
| 0.7833333333333333 | 43.079 |
| 0.7840277777777778 | 38.653 |
| 0.7847222222222222 | 38.653 |
| 0.7854166666666668 | 38.653 |
| 0.7861111111111111 | 34.234 |
| 0.7868055555555555 | 34.234 |
| 0.7875 | 34.234 |
| 0.7881944444444445 | 34.234 |
| 0.7888888888888889 | 34.234 |
| 0.7895833333333333 | 34.234 |
| 0.7902777777777777 | 34.234 |
| 0.7909722222222223 | 34.234 |
| 0.7916666666666666 | 29.823 |
| 0.7923611111111111 | 29.823 |
| 0.7930555555555556 | 29.823 |
| 0.7937500000000001 | 29.823 |
| 0.7944444444444444 | 29.823 |
| 0.7951388888888888 | 29.823 |
| 0.7958333333333334 | 29.823 |
| 0.7965277777777778 | 25.419 |
| 0.7972222222222222 | 21.024 |
| 0.7979166666666666 | 21.024 |
| 0.7986111111111112 | 21.024 |
| 0.7993055555555556 | 21.024 |
| 0.7999999999999999 | 16.636 |
| 0.8006944444444444 | 16.636 |
| 0.8013888888888889 | 12.257 |
| 0.8020833333333334 | 12.257 |
| 0.8027777777777777 | 12.257 |
| 0.8034722222222223 | 12.257 |
| 0.8041666666666667 | 7.887 |
| 0.8048611111111111 | 7.887 |
| 0.8055555555555555 | 7.887 |
| 0.80625 | 7.887 |
| 0.8069444444444445 | 7.887 |
| 0.8076388888888889 | 3.525 |
| 0.8083333333333332 | 3.525 |
| 0.8090277777777778 | 3.525 |
| 0.8097222222222222 | 3.525 |
| 0.8104166666666667 | 3.525 |
| 0.811111111111111 | 3.525 |
| 0.8118055555555556 | 3.525 |
| 0.8125 | 3.525 |
| 0.8131944444444444 | 3.525 |
| 0.813888888888889 | 3.525 |
| 0.8145833333333333 | 3.525 |
| 0.8152777777777778 | 3.525 |
| 0.8159722222222222 | 0 |
| 0.8166666666666668 | 0 |
| 0.8173611111111111 | 0 |
| 0.8180555555555555 | 0 |
| 0.81875 | 0 |
| 0.8194444444444445 | 0 |
| 0.8201388888888889 | 0 |
| 0.8208333333333333 | 0 |
| 0.8215277777777777 | 0 |
| 0.8222222222222223 | 0 |
| 0.8229166666666666 | 0 |
| 0.8236111111111111 | 0 |
| 0.8243055555555556 | 0 |
| 0.8250000000000001 | 0 |
| 0.8256944444444444 | 0 |
| 0.8263888888888888 | 0 |
| 0.8270833333333334 | 0 |
| 0.8277777777777778 | 0 |
| 0.8284722222222222 | 0 |
| 0.8291666666666666 | 0 |
| 0.8298611111111112 | 0 |
| 0.8305555555555556 | 0 |
| 0.8312499999999999 | 0 |
| 0.8319444444444444 | 0 |
| 0.8326388888888889 | 0 |
| 0.8333333333333334 | 0 |
| 0.8340277777777777 | 0 |
| 0.8347222222222223 | 0 |
| 0.8354166666666667 | 0 |
| 0.8361111111111111 | 0 |
| 0.8368055555555555 | 0 |
| 0.8375 | 0 |
| 0.8381944444444445 | 0 |
| 0.8388888888888889 | 0 |
| 0.8395833333333332 | 0 |
| 0.8402777777777778 | 0 |
| 0.8409722222222222 | 0 |
| 0.8416666666666667 | 0 |
| 0.842361111111111 | 0 |
| 0.8430555555555556 | 0 |
| 0.84375 | 0 |
| 0.8444444444444444 | 0 |
| 0.845138888888889 | 0 |
| 0.8458333333333333 | 0 |
| 0.8465277777777778 | 0 |
| 0.8472222222222222 | 0 |
| 0.8479166666666668 | 0 |
| 0.8486111111111111 | 0 |
| 0.8493055555555555 | 0 |
| 0.85 | 0 |
| 0.8506944444444445 | 0 |
| 0.8513888888888889 | 0 |
| 0.8520833333333333 | 0 |
| 0.8527777777777777 | 0 |
| 0.8534722222222223 | 0 |
| 0.8541666666666666 | 0 |
| 0.8548611111111111 | 0 |
| 0.8555555555555556 | 0 |
| 0.8562500000000001 | 0 |
| 0.8569444444444444 | 0 |
| 0.8576388888888888 | 0 |
| 0.8583333333333334 | 0 |
| 0.8590277777777778 | 0 |
| 0.8597222222222222 | 0 |
| 0.8604166666666666 | 0 |
| 0.8611111111111112 | 0 |
| 0.8618055555555556 | 0 |
| 0.8624999999999999 | 0 |
| 0.8631944444444444 | 0 |
| 0.8638888888888889 | 0 |
| 0.8645833333333334 | 0 |
| 0.8652777777777777 | 0 |
| 0.8659722222222223 | 0 |
| 0.8666666666666667 | 0 |
| 0.8673611111111111 | 0 |
| 0.8680555555555555 | 0 |
| 0.86875 | 0 |
| 0.8694444444444445 | 0 |
| 0.8701388888888889 | 0 |
| 0.8708333333333332 | 0 |
| 0.8715277777777778 | 0 |
| 0.8722222222222222 | 0 |
| 0.8729166666666667 | 0 |
| 0.873611111111111 | 0 |
| 0.8743055555555556 | 0 |
| 0.875 | 0 |
| 0.8756944444444444 | 0 |
| 0.876388888888889 | 0 |
| 0.8770833333333333 | 0 |
| 0.8777777777777778 | 0 |
| 0.8784722222222222 | 0 |
| 0.8791666666666668 | 0 |
| 0.8798611111111111 | 0 |
| 0.8805555555555555 | 0 |
| 0.88125 | 0 |
| 0.8819444444444445 | 0 |
| 0.8826388888888889 | 0 |
| 0.8833333333333333 | 0 |
| 0.8840277777777777 | 0 |
| 0.8847222222222223 | 0 |
| 0.8854166666666666 | 0 |
| 0.8861111111111111 | 0 |
| 0.8868055555555556 | 0 |
| 0.8875000000000001 | 0 |
| 0.8881944444444444 | 0 |
| 0.8888888888888888 | 0 |
| 0.8895833333333334 | 0 |
| 0.8902777777777778 | 0 |
| 0.8909722222222222 | 0 |
| 0.8916666666666666 | 0 |
| 0.8923611111111112 | 0 |
| 0.8930555555555556 | 0 |
| 0.8937499999999999 | 0 |
| 0.8944444444444444 | 0 |
| 0.8951388888888889 | 0 |
| 0.8958333333333334 | 0 |
| 0.8965277777777777 | 0 |
| 0.8972222222222223 | 0 |
| 0.8979166666666667 | 0 |
| 0.8986111111111111 | 0 |
| 0.8993055555555555 | 0 |
| 0.9 | 0 |
| 0.9006944444444445 | 0 |
| 0.9013888888888889 | 0 |
| 0.9020833333333332 | 0 |
| 0.9027777777777778 | 0 |
| 0.9034722222222222 | 0 |
| 0.9041666666666667 | 0 |
| 0.904861111111111 | 0 |
| 0.9055555555555556 | 0 |
| 0.90625 | 0 |
| 0.9069444444444444 | 0 |
| 0.907638888888889 | 0 |
| 0.9083333333333333 | 0 |
| 0.9090277777777778 | 0 |
| 0.9097222222222222 | 0 |
| 0.9104166666666668 | 0 |
| 0.9111111111111111 | 0 |
| 0.9118055555555555 | 0 |
| 0.9125 | 0 |
| 0.9131944444444445 | 0 |
| 0.9138888888888889 | 0 |
| 0.9145833333333333 | 0 |
| 0.9152777777777777 | 0 |
| 0.9159722222222223 | 0 |
| 0.9166666666666666 | 0 |
| 0.9173611111111111 | 0 |
| 0.9180555555555556 | 0 |
| 0.9187500000000001 | 0 |
| 0.9194444444444444 | 0 |
| 0.9201388888888888 | 0 |
| 0.9208333333333334 | 0 |
| 0.9215277777777778 | 0 |
| 0.9222222222222222 | 0 |
| 0.9229166666666666 | 0 |
| 0.9236111111111112 | 0 |
| 0.9243055555555556 | 0 |
| 0.9249999999999999 | 0 |
| 0.9256944444444444 | 0 |
| 0.9263888888888889 | 0 |
| 0.9270833333333334 | 0 |
| 0.9277777777777777 | 0 |
| 0.9284722222222223 | 0 |
| 0.9291666666666667 | 0 |
| 0.9298611111111111 | 0 |
| 0.9305555555555555 | 0 |
| 0.93125 | 0 |
| 0.9319444444444445 | 0 |
| 0.9326388888888889 | 0 |
| 0.9333333333333332 | 0 |
| 0.9340277777777778 | 0 |
| 0.9347222222222222 | 0 |
| 0.9354166666666667 | 0 |
| 0.936111111111111 | 0 |
| 0.9368055555555556 | 0 |
| 0.9375 | 0 |
| 0.9381944444444444 | 0 |
| 0.938888888888889 | 0 |
| 0.9395833333333333 | 0 |
| 0.9402777777777778 | 0 |
| 0.9409722222222222 | 0 |
| 0.9416666666666668 | 0 |
| 0.9423611111111111 | 0 |
| 0.9430555555555555 | 0 |
| 0.94375 | 0 |
| 0.9444444444444445 | 0 |
| 0.9451388888888889 | 0 |
| 0.9458333333333333 | 0 |
| 0.9465277777777777 | 0 |
| 0.9472222222222223 | 0 |
| 0.9479166666666666 | 0 |
| 0.9486111111111111 | 0 |
| 0.9493055555555556 | 0 |
| 0.9500000000000001 | 0 |
| 0.9506944444444444 | 0 |
| 0.9513888888888888 | 0 |
| 0.9520833333333334 | 0 |
| 0.9527777777777778 | 0 |
| 0.9534722222222222 | 0 |
| 0.9541666666666666 | 0 |
| 0.9548611111111112 | 0 |
| 0.9555555555555556 | 0 |
| 0.9562499999999999 | 0 |
| 0.9569444444444444 | 0 |
| 0.9576388888888889 | 0 |
| 0.9583333333333334 | 0 |
| 0.9590277777777777 | 0 |
| 0.9597222222222223 | 0 |
| 0.9604166666666667 | 0 |
| 0.9611111111111111 | 0 |
| 0.9618055555555555 | 0 |
| 0.9625 | 0 |
| 0.9631944444444445 | 0 |
| 0.9638888888888889 | 0 |
| 0.9645833333333332 | 0 |
| 0.9652777777777778 | 0 |
| 0.9659722222222222 | 0 |
| 0.9666666666666667 | 0 |
| 0.967361111111111 | 0 |
| 0.9680555555555556 | 0 |
| 0.96875 | 0 |
| 0.9694444444444444 | 0 |
| 0.970138888888889 | 0 |
| 0.9708333333333333 | 0 |
| 0.9715277777777778 | 0 |
| 0.9722222222222222 | 0 |
| 0.9729166666666668 | 0 |
| 0.9736111111111111 | 0 |
| 0.9743055555555555 | 0 |
| 0.975 | 0 |
| 0.9756944444444445 | 0 |
| 0.9763888888888889 | 0 |
| 0.9770833333333333 | 0 |
| 0.9777777777777777 | 0 |
| 0.9784722222222223 | 0 |
| 0.9791666666666666 | 0 |
| 0.9798611111111111 | 0 |
| 0.9805555555555556 | 0 |
| 0.9812500000000001 | 0 |
| 0.9819444444444444 | 0 |
| 0.9826388888888888 | 0 |
| 0.9833333333333334 | 0 |
| 0.9840277777777778 | 0 |
| 0.9847222222222222 | 0 |
| 0.9854166666666666 | 0 |
| 0.9861111111111112 | 0 |
| 0.9868055555555556 | 0 |
| 0.9874999999999999 | 0 |
| 0.9881944444444444 | 0 |
| 0.9888888888888889 | 0 |
| 0.9895833333333334 | 0 |
| 0.9902777777777777 | 0 |
| 0.9909722222222223 | 0 |
| 0.9916666666666667 | 0 |
| 0.9923611111111111 | 0 |
| 0.9930555555555555 | 0 |
| 0.99375 | 0 |
| 0.9944444444444445 | 0 |
| 0.9951388888888889 | 0 |
| 0.9958333333333332 | 0 |
| 0.9965277777777778 | 0 |
| 0.9972222222222222 | 0 |
| 0.9979166666666667 | 0 |
| 0.998611111111111 | 0 |
| 0.9993055555555556 | 0 |